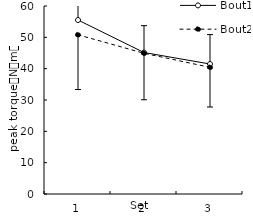
| Category | Bout1 | Bout2 |
|---|---|---|
| 1.0 | 55.525 | 50.813 |
| 2.0 | 45.15 | 44.912 |
| 3.0 | 41.488 | 40.425 |